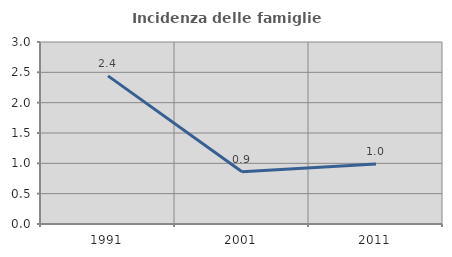
| Category | Incidenza delle famiglie numerose |
|---|---|
| 1991.0 | 2.442 |
| 2001.0 | 0.861 |
| 2011.0 | 0.988 |